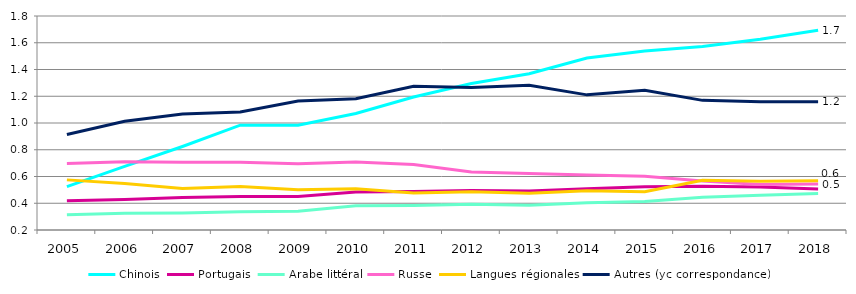
| Category | Chinois | Portugais | Arabe littéral | Russe | Langues régionales | Autres (yc correspondance) |
|---|---|---|---|---|---|---|
| 2005 | 0.525 | 0.419 | 0.313 | 0.697 | 0.575 | 0.914 |
| 2006 | 0.675 | 0.427 | 0.325 | 0.71 | 0.547 | 1.013 |
| 2007 | 0.825 | 0.442 | 0.327 | 0.707 | 0.51 | 1.068 |
| 2008 | 0.983 | 0.45 | 0.337 | 0.706 | 0.524 | 1.082 |
| 2009 | 0.983 | 0.451 | 0.341 | 0.695 | 0.5 | 1.165 |
| 2010 | 1.071 | 0.484 | 0.381 | 0.709 | 0.508 | 1.182 |
| 2011 | 1.194 | 0.487 | 0.383 | 0.69 | 0.477 | 1.274 |
| 2012 | 1.295 | 0.495 | 0.393 | 0.634 | 0.485 | 1.266 |
| 2013 | 1.369 | 0.491 | 0.384 | 0.623 | 0.474 | 1.283 |
| 2014 | 1.485 | 0.508 | 0.403 | 0.612 | 0.494 | 1.21 |
| 2015 | 1.538 | 0.524 | 0.413 | 0.602 | 0.486 | 1.245 |
| 2016 | 1.571 | 0.528 | 0.446 | 0.565 | 0.572 | 1.169 |
| 2017 | 1.626 | 0.521 | 0.46 | 0.539 | 0.564 | 1.158 |
| 2018 | 1.693 | 0.507 | 0.472 | 0.544 | 0.568 | 1.158 |